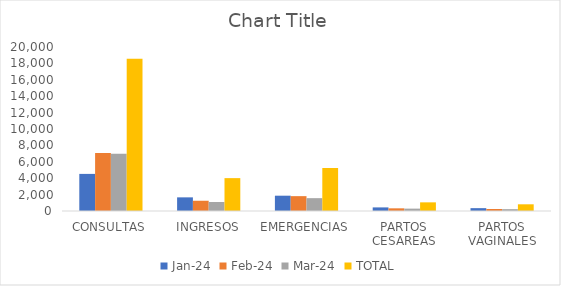
| Category | ene-24 | feb-24 | mar-24 | TOTAL |
|---|---|---|---|---|
| CONSULTAS | 4525 | 7072 | 6976 | 18573 |
| INGRESOS | 1664 | 1250 | 1095 | 4009 |
| EMERGENCIAS | 1867 | 1812 | 1566 | 5245 |
| PARTOS CESAREAS | 439 | 326 | 290 | 1055 |
| PARTOS VAGINALES | 348 | 244 | 225 | 817 |